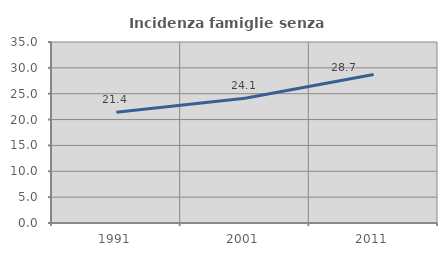
| Category | Incidenza famiglie senza nuclei |
|---|---|
| 1991.0 | 21.406 |
| 2001.0 | 24.133 |
| 2011.0 | 28.701 |